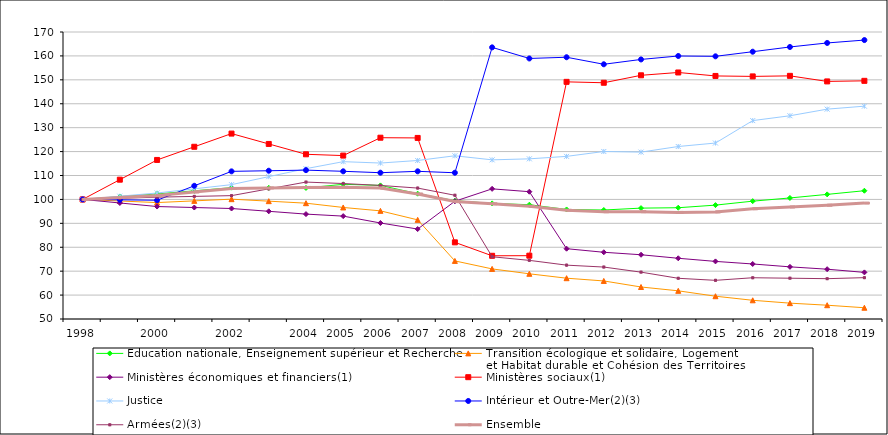
| Category | Éducation nationale, Enseignement supérieur et Recherche | Transition écologique et solidaire, Logement 
et Habitat durable et Cohésion des Territoires | Ministères économiques et financiers(1) | Ministères sociaux(1) | Justice | Intérieur et Outre-Mer(2)(3) | Armées(2)(3) | Ensemble |
|---|---|---|---|---|---|---|---|---|
| 1998 | 100 | 100 | 100 | 100 | 100 | 100 | 100 | 100 |
|  | 101.145 | 99.34 | 98.512 | 108.251 | 101.343 | 99.828 | 100.468 | 100.833 |
| 2000 | 102.29 | 98.679 | 97.025 | 116.502 | 102.686 | 99.656 | 100.936 | 101.665 |
|  | 103.603 | 99.393 | 96.611 | 122.012 | 104.431 | 105.694 | 101.26 | 103.116 |
| 2002 | 104.917 | 100.107 | 96.198 | 127.523 | 106.176 | 111.732 | 101.584 | 104.567 |
|  | 104.851 | 99.266 | 95.029 | 123.195 | 109.517 | 111.989 | 104.417 | 104.787 |
| 2004 | 104.784 | 98.426 | 93.86 | 118.867 | 112.859 | 112.247 | 107.25 | 105.008 |
| 2005 | 106.317 | 96.634 | 93.015 | 118.329 | 115.782 | 111.751 | 106.641 | 105.086 |
| 2006 | 105.86 | 95.22 | 90.145 | 125.802 | 115.209 | 111.169 | 105.85 | 104.729 |
| 2007 | 102.405 | 91.451 | 87.603 | 125.71 | 116.276 | 111.747 | 104.745 | 102.282 |
| 2008 | 99.468 | 74.288 | 99.237 | 82.047 | 118.247 | 111.144 | 101.741 | 99.172 |
| 2009 | 98.34 | 70.949 | 104.415 | 76.433 | 116.541 | 163.575 | 76.024 | 98.163 |
| 2010 | 97.779 | 68.897 | 103.231 | 76.476 | 116.967 | 158.934 | 74.518 | 97.149 |
| 2011 | 95.802 | 67.061 | 79.393 | 149.157 | 117.992 | 159.448 | 72.515 | 95.481 |
| 2012 | 95.569 | 65.91 | 77.903 | 148.78 | 120.036 | 156.503 | 71.72 | 94.849 |
| 2013 | 96.365 | 63.386 | 76.859 | 151.896 | 119.785 | 158.526 | 69.592 | 94.878 |
| 2014 | 96.528 | 61.784 | 75.391 | 153.076 | 122.125 | 159.968 | 67.02 | 94.561 |
| 2015 | 97.617 | 59.526 | 74.085 | 151.628 | 123.573 | 159.832 | 66.167 | 94.776 |
| 2016 | 99.266 | 57.826 | 73.009 | 151.434 | 132.956 | 161.758 | 67.251 | 96.1 |
| 2017 | 100.611 | 56.628 | 71.805 | 151.666 | 134.982 | 163.735 | 67.055 | 96.84 |
| 2018 | 102.107 | 55.764 | 70.827 | 149.34 | 137.742 | 165.42 | 66.859 | 97.579 |
| 2019 | 103.636 | 54.704 | 69.493 | 149.579 | 138.991 | 166.629 | 67.29 | 98.459 |